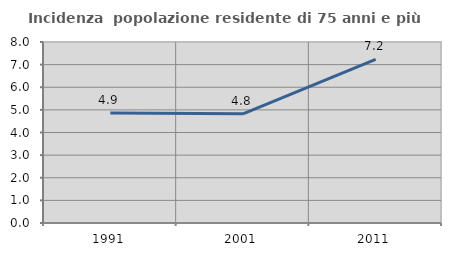
| Category | Incidenza  popolazione residente di 75 anni e più |
|---|---|
| 1991.0 | 4.866 |
| 2001.0 | 4.827 |
| 2011.0 | 7.229 |